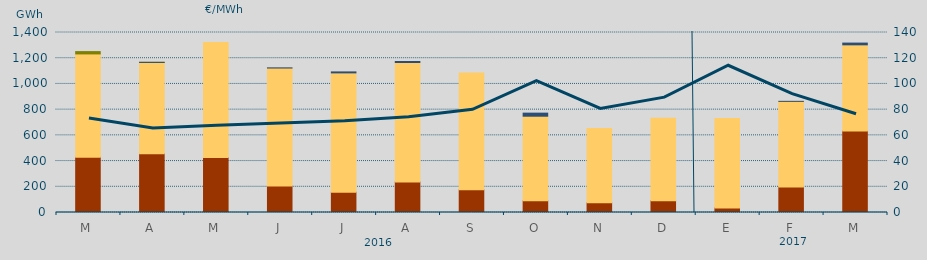
| Category | Hidráulica | Carbón | Ciclo Combinado | Otras Renovables | Consumo Bombeo |
|---|---|---|---|---|---|
| M | 3584.5 | 426186 | 803574 | 18068.1 | 0 |
| A | 1458 | 456275.7 | 709097 | 1030.5 | 200 |
| M | 8664.2 | 418905 | 894330.4 | 0 | 0 |
| J | 0 | 206083.6 | 917663.8 | 0 | 1217 |
| J | 544 | 157445 | 927968.4 | 0 | 7584 |
| A | 0 | 238113.9 | 928531.9 | 0 | 7932.8 |
| S | 0 | 177358.6 | 907062.2 | 0 | 0 |
| O | 0 | 91594.1 | 657310.6 | 0 | 23959.3 |
| N | 240 | 76065.2 | 577468 | 0 | 0 |
| D | 1160 | 91091.6 | 640964.5 | 0 | 0 |
| E | 0 | 35729 | 696156.2 | 0 | 0 |
| F | 712.6 | 198516.2 | 665095.2 | 0 | 139.6 |
| M | 1411.7 | 631868 | 670791.6 | 0 | 13667.9 |